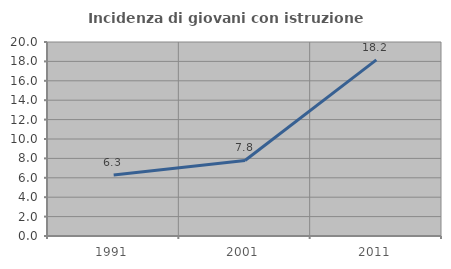
| Category | Incidenza di giovani con istruzione universitaria |
|---|---|
| 1991.0 | 6.296 |
| 2001.0 | 7.785 |
| 2011.0 | 18.155 |